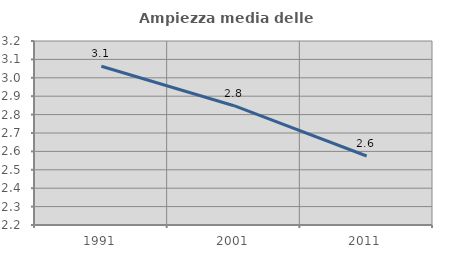
| Category | Ampiezza media delle famiglie |
|---|---|
| 1991.0 | 3.063 |
| 2001.0 | 2.848 |
| 2011.0 | 2.575 |